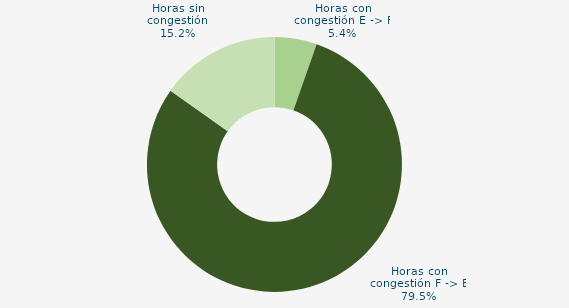
| Category | Horas con congestión E -> F |
|---|---|
| Horas con congestión E -> F | 5.357 |
| Horas con congestión F -> E | 79.464 |
| Horas sin congestión | 15.179 |